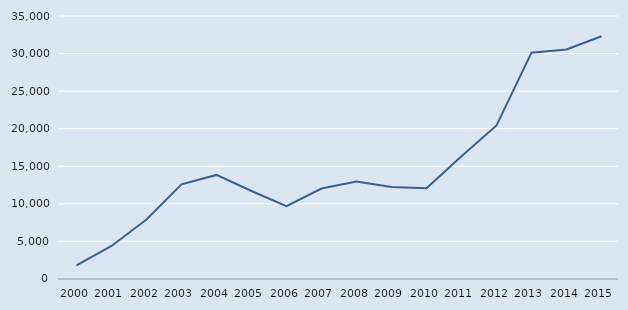
| Category | Series 0 |
|---|---|
| 2000.0 | 1811 |
| 2001.0 | 4396 |
| 2002.0 | 7915 |
| 2003.0 | 12603 |
| 2004.0 | 13850 |
| 2005.0 | 11710 |
| 2006.0 | 9700 |
| 2007.0 | 12040 |
| 2008.0 | 12980 |
| 2009.0 | 12230 |
| 2010.0 | 12080 |
| 2011.0 | 16350 |
| 2012.0 | 20443 |
| 2013.0 | 30121 |
| 2014.0 | 30546 |
| 2015.0 | 32301 |